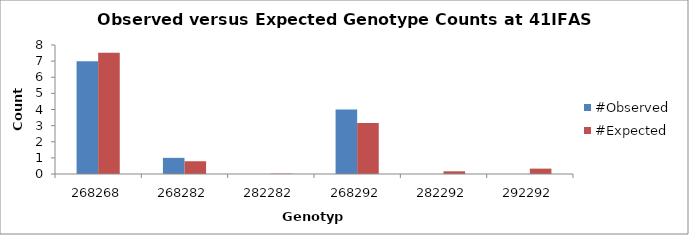
| Category | #Observed | #Expected |
|---|---|---|
| 268268.0 | 7 | 7.521 |
| 268282.0 | 1 | 0.792 |
| 282282.0 | 0 | 0.021 |
| 268292.0 | 4 | 3.167 |
| 282292.0 | 0 | 0.167 |
| 292292.0 | 0 | 0.333 |